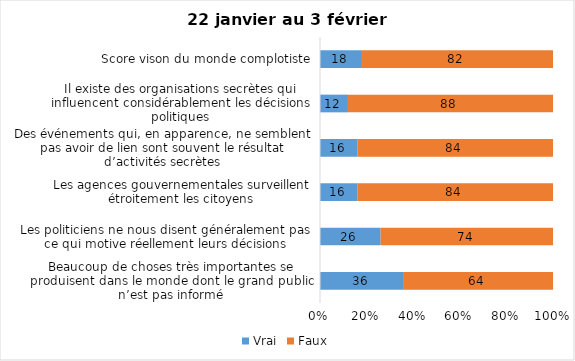
| Category | Vrai | Faux |
|---|---|---|
| Beaucoup de choses très importantes se produisent dans le monde dont le grand public n’est pas informé | 36 | 64 |
| Les politiciens ne nous disent généralement pas ce qui motive réellement leurs décisions | 26 | 74 |
| Les agences gouvernementales surveillent étroitement les citoyens | 16 | 84 |
| Des événements qui, en apparence, ne semblent pas avoir de lien sont souvent le résultat d’activités secrètes | 16 | 84 |
| Il existe des organisations secrètes qui influencent considérablement les décisions politiques | 12 | 88 |
| Score vison du monde complotiste | 18 | 82 |